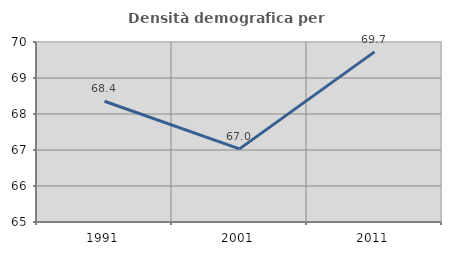
| Category | Densità demografica |
|---|---|
| 1991.0 | 68.355 |
| 2001.0 | 67.032 |
| 2011.0 | 69.727 |